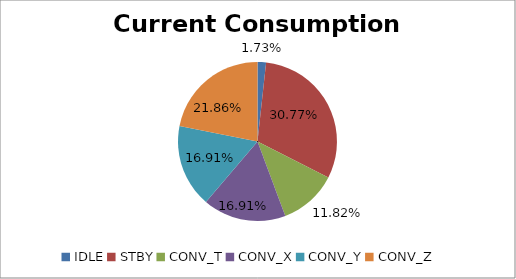
| Category | Series 0 |
|---|---|
| IDLE | 2.248 |
| STBY | 40 |
| CONV_T | 15.36 |
| CONV_X | 21.984 |
| CONV_Y | 21.984 |
| CONV_Z | 28.416 |